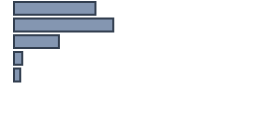
| Category | Percentatge |
|---|---|
| 0 | 33.939 |
| 1 | 41.364 |
| 2 | 18.712 |
| 3 | 3.409 |
| 4 | 2.576 |
| 5 | 0 |